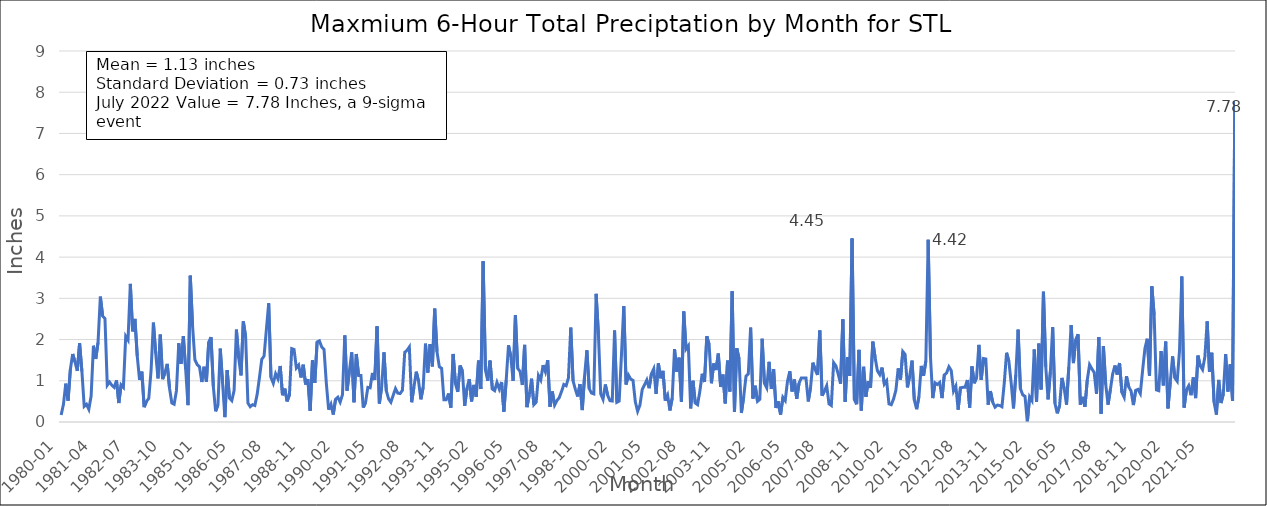
| Category | Series 0 |
|---|---|
| 1980-01 | 0.17 |
| 1980-02 | 0.43 |
| 1980-03 | 0.93 |
| 1980-04 | 0.52 |
| 1980-05 | 1.28 |
| 1980-06 | 1.65 |
| 1980-07 | 1.46 |
| 1980-08 | 1.24 |
| 1980-09 | 1.91 |
| 1980-10 | 1.23 |
| 1980-11 | 0.38 |
| 1980-12 | 0.43 |
| 1981-01 | 0.31 |
| 1981-02 | 0.63 |
| 1981-03 | 1.85 |
| 1981-04 | 1.53 |
| 1981-05 | 1.93 |
| 1981-06 | 3.04 |
| 1981-07 | 2.57 |
| 1981-08 | 2.51 |
| 1981-09 | 0.89 |
| 1981-10 | 0.97 |
| 1981-11 | 0.89 |
| 1981-12 | 0.84 |
| 1982-01 | 1.01 |
| 1982-02 | 0.46 |
| 1982-03 | 0.9 |
| 1982-04 | 0.84 |
| 1982-05 | 2.08 |
| 1982-06 | 1.99 |
| 1982-07 | 3.35 |
| 1982-08 | 2.2 |
| 1982-09 | 2.5 |
| 1982-10 | 1.6 |
| 1982-11 | 1.02 |
| 1982-12 | 1.22 |
| 1983-01 | 0.36 |
| 1983-02 | 0.5 |
| 1983-03 | 0.57 |
| 1983-04 | 1.25 |
| 1983-05 | 2.41 |
| 1983-06 | 1.67 |
| 1983-07 | 1.06 |
| 1983-08 | 2.12 |
| 1983-09 | 1.04 |
| 1983-10 | 1.19 |
| 1983-11 | 1.41 |
| 1983-12 | 0.82 |
| 1984-01 | 0.46 |
| 1984-02 | 0.43 |
| 1984-03 | 0.76 |
| 1984-04 | 1.91 |
| 1984-05 | 1.41 |
| 1984-06 | 2.08 |
| 1984-07 | 1.28 |
| 1984-08 | 0.41 |
| 1984-09 | 3.55 |
| 1984-10 | 2.32 |
| 1984-11 | 1.51 |
| 1984-12 | 1.39 |
| 1985-01 | 1.34 |
| 1985-02 | 0.97 |
| 1985-03 | 1.34 |
| 1985-04 | 0.98 |
| 1985-05 | 1.94 |
| 1985-06 | 2.06 |
| 1985-08 | 0.86 |
| 1985-09 | 0.26 |
| 1985-10 | 0.42 |
| 1985-11 | 1.78 |
| 1985-12 | 0.95 |
| 1986-01 | 0.12 |
| 1986-02 | 1.26 |
| 1986-03 | 0.58 |
| 1986-04 | 0.52 |
| 1986-05 | 0.76 |
| 1986-06 | 2.24 |
| 1986-07 | 1.55 |
| 1986-08 | 1.13 |
| 1986-09 | 2.44 |
| 1986-10 | 2.07 |
| 1986-11 | 0.46 |
| 1986-12 | 0.37 |
| 1987-01 | 0.42 |
| 1987-02 | 0.4 |
| 1987-03 | 0.67 |
| 1987-04 | 1.08 |
| 1987-05 | 1.52 |
| 1987-06 | 1.6 |
| 1987-07 | 2.24 |
| 1987-08 | 2.88 |
| 1987-09 | 1.08 |
| 1987-10 | 0.94 |
| 1987-11 | 1.17 |
| 1987-12 | 1.05 |
| 1988-01 | 1.36 |
| 1988-02 | 0.65 |
| 1988-03 | 0.81 |
| 1988-04 | 0.5 |
| 1988-05 | 0.66 |
| 1988-06 | 1.78 |
| 1988-07 | 1.76 |
| 1988-08 | 1.31 |
| 1988-09 | 1.38 |
| 1988-10 | 1.08 |
| 1988-11 | 1.39 |
| 1988-12 | 0.91 |
| 1989-01 | 1.04 |
| 1989-02 | 0.27 |
| 1989-03 | 1.5 |
| 1989-04 | 0.95 |
| 1989-05 | 1.94 |
| 1989-06 | 1.97 |
| 1989-07 | 1.82 |
| 1989-08 | 1.76 |
| 1989-09 | 0.94 |
| 1989-10 | 0.3 |
| 1989-11 | 0.43 |
| 1989-12 | 0.18 |
| 1990-01 | 0.55 |
| 1990-02 | 0.6 |
| 1990-03 | 0.48 |
| 1990-04 | 0.66 |
| 1990-05 | 2.1 |
| 1990-06 | 0.76 |
| 1990-07 | 1.23 |
| 1990-08 | 1.69 |
| 1990-09 | 0.48 |
| 1990-10 | 1.65 |
| 1990-11 | 1.13 |
| 1990-12 | 1.13 |
| 1991-01 | 0.35 |
| 1991-02 | 0.47 |
| 1991-03 | 0.84 |
| 1991-04 | 0.83 |
| 1991-05 | 1.19 |
| 1991-06 | 1.02 |
| 1991-07 | 2.32 |
| 1991-08 | 0.45 |
| 1991-09 | 0.85 |
| 1991-10 | 1.69 |
| 1991-11 | 0.76 |
| 1991-12 | 0.56 |
| 1992-01 | 0.48 |
| 1992-02 | 0.65 |
| 1992-03 | 0.81 |
| 1992-04 | 0.7 |
| 1992-05 | 0.69 |
| 1992-06 | 0.77 |
| 1992-07 | 1.69 |
| 1992-08 | 1.74 |
| 1992-09 | 1.82 |
| 1992-10 | 0.48 |
| 1992-11 | 0.85 |
| 1992-12 | 1.22 |
| 1993-01 | 0.99 |
| 1993-02 | 0.55 |
| 1993-03 | 0.84 |
| 1993-04 | 1.9 |
| 1993-05 | 1.2 |
| 1993-06 | 1.89 |
| 1993-07 | 1.35 |
| 1993-08 | 2.75 |
| 1993-09 | 1.7 |
| 1993-10 | 1.34 |
| 1993-11 | 1.3 |
| 1993-12 | 0.54 |
| 1994-01 | 0.54 |
| 1994-02 | 0.69 |
| 1994-03 | 0.35 |
| 1994-04 | 1.65 |
| 1994-05 | 0.93 |
| 1994-06 | 0.73 |
| 1994-07 | 1.37 |
| 1994-08 | 1.24 |
| 1994-09 | 0.39 |
| 1994-10 | 0.82 |
| 1994-11 | 1.04 |
| 1994-12 | 0.5 |
| 1995-01 | 0.9 |
| 1995-02 | 0.61 |
| 1995-03 | 1.49 |
| 1995-04 | 0.8 |
| 1995-05 | 3.9 |
| 1995-06 | 1.26 |
| 1995-07 | 1 |
| 1995-08 | 1.49 |
| 1995-09 | 0.8 |
| 1995-10 | 0.76 |
| 1995-11 | 0.96 |
| 1995-12 | 0.8 |
| 1996-01 | 0.97 |
| 1996-02 | 0.25 |
| 1996-03 | 1.01 |
| 1996-04 | 1.86 |
| 1996-05 | 1.59 |
| 1996-06 | 1 |
| 1996-07 | 2.59 |
| 1996-08 | 1.3 |
| 1996-09 | 1.23 |
| 1996-10 | 0.9 |
| 1996-11 | 1.87 |
| 1996-12 | 0.36 |
| 1997-01 | 0.65 |
| 1997-02 | 1.05 |
| 1997-03 | 0.42 |
| 1997-04 | 0.48 |
| 1997-05 | 1.13 |
| 1997-06 | 1.02 |
| 1997-07 | 1.38 |
| 1997-08 | 1.22 |
| 1997-09 | 1.5 |
| 1997-10 | 0.37 |
| 1997-11 | 0.74 |
| 1997-12 | 0.41 |
| 1998-01 | 0.52 |
| 1998-02 | 0.59 |
| 1998-03 | 0.74 |
| 1998-04 | 0.91 |
| 1998-05 | 0.88 |
| 1998-06 | 1.07 |
| 1998-07 | 2.29 |
| 1998-08 | 1 |
| 1998-09 | 0.79 |
| 1998-10 | 0.62 |
| 1998-11 | 0.92 |
| 1998-12 | 0.29 |
| 1999-01 | 1.12 |
| 1999-02 | 1.74 |
| 1999-03 | 0.81 |
| 1999-04 | 0.7 |
| 1999-05 | 0.68 |
| 1999-06 | 3.11 |
| 1999-07 | 2.13 |
| 1999-08 | 0.68 |
| 1999-09 | 0.55 |
| 1999-10 | 0.91 |
| 1999-11 | 0.65 |
| 1999-12 | 0.52 |
| 2000-01 | 0.51 |
| 2000-02 | 2.22 |
| 2000-03 | 0.48 |
| 2000-04 | 0.51 |
| 2000-05 | 1.64 |
| 2000-06 | 2.81 |
| 2000-07 | 0.91 |
| 2000-08 | 1.14 |
| 2000-09 | 1.04 |
| 2000-10 | 1.01 |
| 2000-11 | 0.49 |
| 2000-12 | 0.26 |
| 2001-01 | 0.41 |
| 2001-02 | 0.79 |
| 2001-03 | 0.9 |
| 2001-04 | 1.02 |
| 2001-05 | 0.82 |
| 2001-06 | 1.17 |
| 2001-07 | 1.29 |
| 2001-08 | 0.68 |
| 2001-09 | 1.42 |
| 2001-10 | 1.06 |
| 2001-11 | 1.24 |
| 2001-12 | 0.52 |
| 2002-01 | 0.65 |
| 2002-02 | 0.28 |
| 2002-03 | 0.58 |
| 2002-04 | 1.77 |
| 2002-05 | 1.22 |
| 2002-06 | 1.56 |
| 2002-07 | 0.49 |
| 2002-08 | 2.68 |
| 2002-09 | 1.77 |
| 2002-10 | 1.85 |
| 2002-11 | 0.33 |
| 2002-12 | 1 |
| 2003-01 | 0.46 |
| 2003-02 | 0.42 |
| 2003-03 | 0.75 |
| 2003-04 | 1.17 |
| 2003-05 | 0.97 |
| 2003-06 | 2.08 |
| 2003-07 | 1.88 |
| 2003-08 | 0.94 |
| 2003-09 | 1.42 |
| 2003-10 | 1.26 |
| 2003-11 | 1.66 |
| 2003-12 | 0.85 |
| 2004-01 | 1.15 |
| 2004-02 | 0.45 |
| 2004-03 | 1.49 |
| 2004-04 | 0.74 |
| 2004-05 | 3.17 |
| 2004-06 | 0.25 |
| 2004-07 | 1.79 |
| 2004-08 | 1.53 |
| 2004-09 | 0.22 |
| 2004-10 | 0.61 |
| 2004-11 | 1.11 |
| 2004-12 | 1.17 |
| 2005-01 | 2.29 |
| 2005-02 | 0.57 |
| 2005-03 | 0.88 |
| 2005-04 | 0.5 |
| 2005-05 | 0.55 |
| 2005-06 | 2.02 |
| 2005-07 | 0.94 |
| 2005-08 | 0.83 |
| 2005-09 | 1.46 |
| 2005-10 | 0.8 |
| 2005-11 | 1.28 |
| 2005-12 | 0.34 |
| 2006-01 | 0.5 |
| 2006-02 | 0.18 |
| 2006-03 | 0.6 |
| 2006-04 | 0.52 |
| 2006-05 | 0.99 |
| 2006-06 | 1.23 |
| 2006-07 | 0.74 |
| 2006-08 | 1.03 |
| 2006-09 | 0.56 |
| 2006-10 | 0.94 |
| 2006-11 | 1.07 |
| 2006-12 | 1.07 |
| 2007-01 | 1.07 |
| 2007-02 | 0.5 |
| 2007-03 | 0.84 |
| 2007-04 | 1.44 |
| 2007-05 | 1.27 |
| 2007-06 | 1.14 |
| 2007-07 | 2.22 |
| 2007-08 | 0.64 |
| 2007-09 | 0.75 |
| 2007-10 | 0.88 |
| 2007-11 | 0.44 |
| 2007-12 | 0.4 |
| 2008-01 | 1.44 |
| 2008-02 | 1.36 |
| 2008-03 | 1.16 |
| 2008-04 | 0.93 |
| 2008-05 | 2.49 |
| 2008-06 | 0.49 |
| 2008-07 | 1.57 |
| 2008-08 | 1.12 |
| 2008-09 | 4.45 |
| 2008-10 | 0.54 |
| 2008-11 | 0.43 |
| 2008-12 | 1.75 |
| 2009-01 | 0.28 |
| 2009-02 | 1.34 |
| 2009-03 | 0.61 |
| 2009-04 | 0.99 |
| 2009-05 | 0.83 |
| 2009-06 | 1.95 |
| 2009-07 | 1.56 |
| 2009-08 | 1.24 |
| 2009-09 | 1.15 |
| 2009-10 | 1.32 |
| 2009-11 | 0.92 |
| 2009-12 | 1 |
| 2010-01 | 0.44 |
| 2010-02 | 0.42 |
| 2010-03 | 0.56 |
| 2010-04 | 0.77 |
| 2010-05 | 1.3 |
| 2010-06 | 1.03 |
| 2010-07 | 1.71 |
| 2010-08 | 1.64 |
| 2010-09 | 0.84 |
| 2010-10 | 1.12 |
| 2010-11 | 1.49 |
| 2010-12 | 0.53 |
| 2011-01 | 0.31 |
| 2011-02 | 0.62 |
| 2011-03 | 1.36 |
| 2011-04 | 1.12 |
| 2011-05 | 1.48 |
| 2011-06 | 4.42 |
| 2011-07 | 1.58 |
| 2011-08 | 0.58 |
| 2011-09 | 0.95 |
| 2011-10 | 0.91 |
| 2011-11 | 0.96 |
| 2011-12 | 0.58 |
| 2012-01 | 1.14 |
| 2012-02 | 1.19 |
| 2012-03 | 1.34 |
| 2012-04 | 1.25 |
| 2012-05 | 0.75 |
| 2012-06 | 0.87 |
| 2012-07 | 0.3 |
| 2012-08 | 0.83 |
| 2012-09 | 0.84 |
| 2012-10 | 0.84 |
| 2012-11 | 1.02 |
| 2012-12 | 0.35 |
| 2013-01 | 1.35 |
| 2013-02 | 0.94 |
| 2013-03 | 1.08 |
| 2013-04 | 1.87 |
| 2013-05 | 1.02 |
| 2013-06 | 1.54 |
| 2013-07 | 1.53 |
| 2013-08 | 0.42 |
| 2013-09 | 0.75 |
| 2013-10 | 0.48 |
| 2013-11 | 0.36 |
| 2013-12 | 0.41 |
| 2014-01 | 0.4 |
| 2014-02 | 0.37 |
| 2014-03 | 0.94 |
| 2014-04 | 1.68 |
| 2014-05 | 1.47 |
| 2014-06 | 0.95 |
| 2014-07 | 0.33 |
| 2014-08 | 1.14 |
| 2014-09 | 2.24 |
| 2014-10 | 0.81 |
| 2014-11 | 0.66 |
| 2014-12 | 0.62 |
| 2015-01 | 0 |
| 2015-02 | 0.61 |
| 2015-03 | 0.52 |
| 2015-04 | 1.76 |
| 2015-05 | 0.49 |
| 2015-06 | 1.9 |
| 2015-07 | 0.79 |
| 2015-08 | 3.16 |
| 2015-09 | 1.34 |
| 2015-10 | 0.55 |
| 2015-11 | 1.22 |
| 2015-12 | 2.3 |
| 2016-01 | 0.45 |
| 2016-02 | 0.21 |
| 2016-03 | 0.4 |
| 2016-04 | 1.07 |
| 2016-05 | 0.81 |
| 2016-06 | 0.42 |
| 2016-07 | 1.33 |
| 2016-08 | 2.35 |
| 2016-09 | 1.43 |
| 2016-10 | 2 |
| 2016-11 | 2.13 |
| 2016-12 | 0.42 |
| 2017-01 | 0.61 |
| 2017-02 | 0.37 |
| 2017-03 | 1.02 |
| 2017-04 | 1.39 |
| 2017-05 | 1.29 |
| 2017-06 | 1.2 |
| 2017-07 | 0.68 |
| 2017-08 | 2.06 |
| 2017-09 | 0.2 |
| 2017-10 | 1.84 |
| 2017-11 | 0.91 |
| 2017-12 | 0.42 |
| 2018-01 | 0.78 |
| 2018-02 | 1.16 |
| 2018-03 | 1.37 |
| 2018-04 | 1.15 |
| 2018-05 | 1.43 |
| 2018-06 | 0.72 |
| 2018-07 | 0.6 |
| 2018-08 | 1.11 |
| 2018-09 | 0.85 |
| 2018-10 | 0.75 |
| 2018-11 | 0.41 |
| 2018-12 | 0.77 |
| 2019-01 | 0.79 |
| 2019-02 | 0.69 |
| 2019-03 | 1.25 |
| 2019-04 | 1.78 |
| 2019-05 | 2.02 |
| 2019-06 | 1.12 |
| 2019-07 | 3.29 |
| 2019-08 | 2.6 |
| 2019-09 | 0.78 |
| 2019-10 | 0.76 |
| 2019-11 | 1.72 |
| 2019-12 | 0.89 |
| 2020-01 | 1.95 |
| 2020-02 | 0.33 |
| 2020-03 | 0.97 |
| 2020-04 | 1.59 |
| 2020-05 | 1.07 |
| 2020-06 | 0.99 |
| 2020-07 | 1.73 |
| 2020-08 | 3.53 |
| 2020-09 | 0.35 |
| 2020-10 | 0.78 |
| 2020-11 | 0.88 |
| 2020-12 | 0.65 |
| 2021-01 | 1.08 |
| 2021-02 | 0.58 |
| 2021-03 | 1.61 |
| 2021-04 | 1.36 |
| 2021-05 | 1.27 |
| 2021-06 | 1.58 |
| 2021-07 | 2.44 |
| 2021-08 | 1.22 |
| 2021-09 | 1.68 |
| 2021-10 | 0.48 |
| 2021-11 | 0.18 |
| 2021-12 | 1.02 |
| 2022-01 | 0.46 |
| 2022-02 | 0.68 |
| 2022-03 | 1.65 |
| 2022-04 | 0.74 |
| 2022-05 | 1.4 |
| 2022-06 | 0.51 |
| 2022-07 | 7.78 |